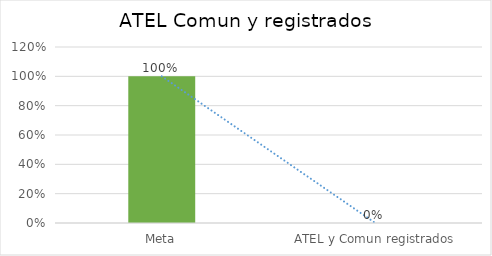
| Category | Series 0 |
|---|---|
| Meta | 1 |
| ATEL y Comun registrados | 0 |